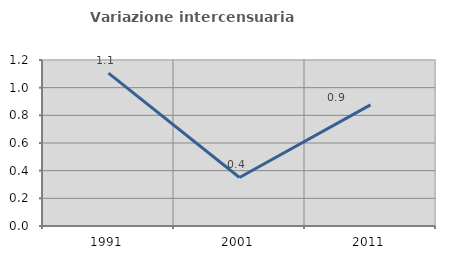
| Category | Variazione intercensuaria annua |
|---|---|
| 1991.0 | 1.105 |
| 2001.0 | 0.351 |
| 2011.0 | 0.875 |